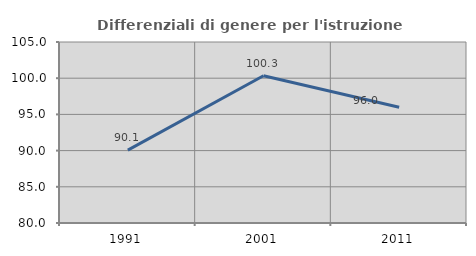
| Category | Differenziali di genere per l'istruzione superiore |
|---|---|
| 1991.0 | 90.064 |
| 2001.0 | 100.33 |
| 2011.0 | 95.982 |